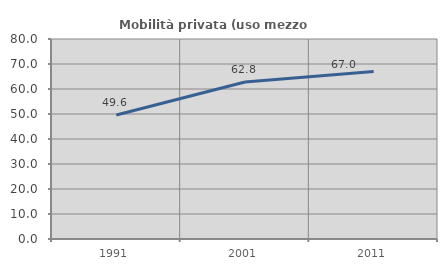
| Category | Mobilità privata (uso mezzo privato) |
|---|---|
| 1991.0 | 49.571 |
| 2001.0 | 62.829 |
| 2011.0 | 66.975 |